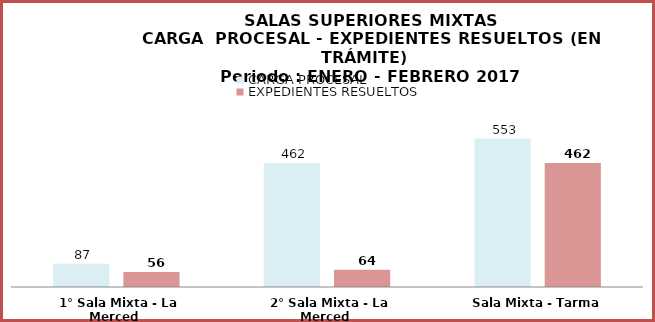
| Category | CARGA PROCESAL | EXPEDIENTES RESUELTOS |
|---|---|---|
| 1° Sala Mixta - La Merced | 87 | 56 |
| 2° Sala Mixta - La Merced | 462 | 64 |
| Sala Mixta - Tarma | 553 | 462 |